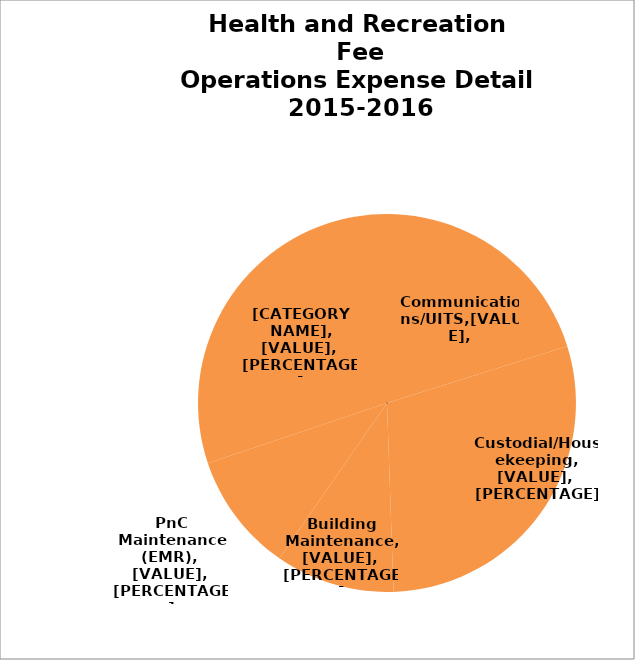
| Category | Series 0 |
|---|---|
|      Communications/UITS                 | 98800 |
|      Custodial/Housekeeping             | 143800 |
|      Building Maintenance                                      | 50000 |
|      PnC Maintenance (EMR)              | 50000 |
|      Sonora Quest Lab (CHS Extern)  | 148000 |